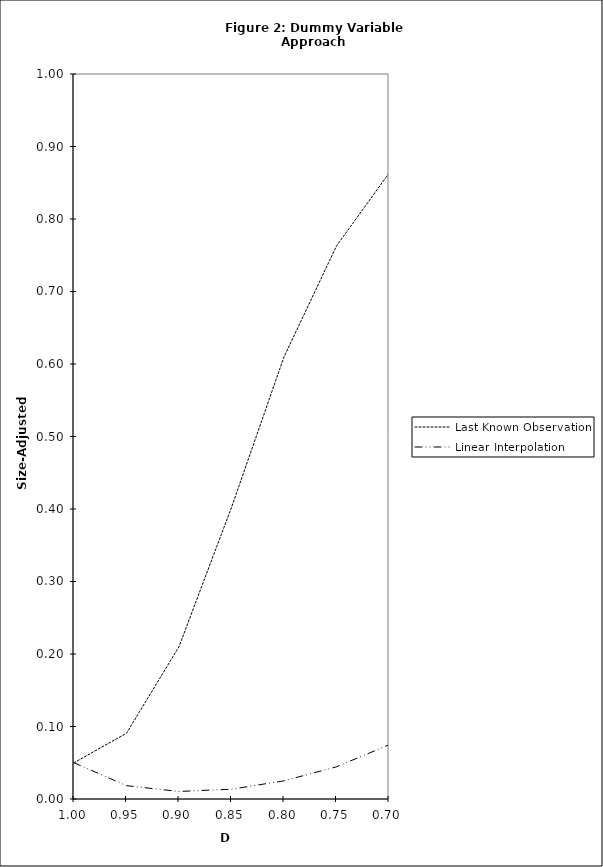
| Category | Last Known Observation | Linear Interpolation |
|---|---|---|
| 1.0 | 0.05 | 0.05 |
| 0.95 | 0.091 | 0.018 |
| 0.9 | 0.21 | 0.01 |
| 0.85 | 0.402 | 0.014 |
| 0.8 | 0.61 | 0.025 |
| 0.75 | 0.763 | 0.044 |
| 0.7 | 0.863 | 0.075 |